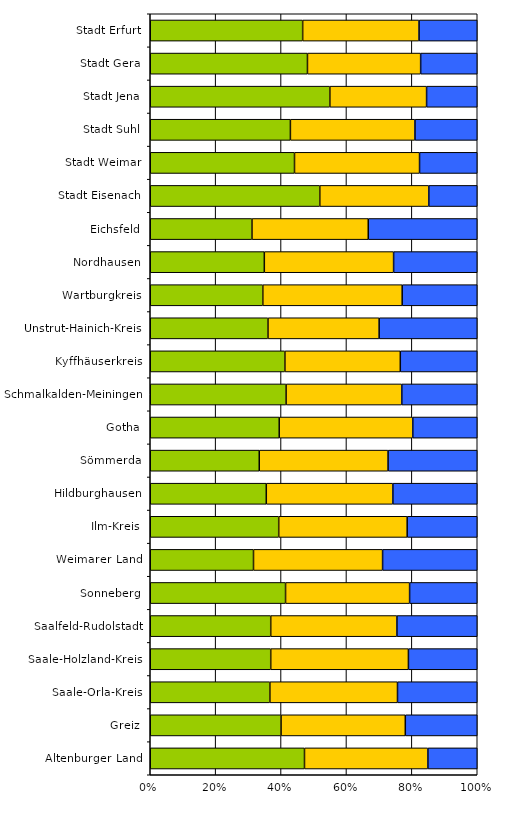
| Category | Series 0 | Series 1 | Series 2 |
|---|---|---|---|
| Altenburger Land | 25 | 20 | 8 |
| Greiz | 20 | 19 | 11 |
| Saale-Orla-Kreis | 15 | 16 | 10 |
| Saale-Holzland-Kreis | 14 | 16 | 8 |
| Saalfeld-Rudolstadt | 21 | 22 | 14 |
| Sonneberg | 12 | 11 | 6 |
| Weimarer Land | 12 | 15 | 11 |
| Ilm-Kreis | 22 | 22 | 12 |
| Hildburghausen | 11 | 12 | 8 |
| Sömmerda | 11 | 13 | 9 |
| Gotha | 28 | 29 | 14 |
| Schmalkalden-Meiningen | 27 | 23 | 15 |
| Kyffhäuserkreis | 14 | 12 | 8 |
| Unstrut-Hainich-Kreis | 18 | 17 | 15 |
| Wartburgkreis | 21 | 26 | 14 |
| Nordhausen | 15 | 17 | 11 |
| Eichsfeld | 14 | 16 | 15 |
| Stadt Eisenach | 14 | 9 | 4 |
| Stadt Weimar | 15 | 13 | 6 |
| Stadt Suhl | 9 | 8 | 4 |
| Stadt Jena | 39 | 21 | 11 |
| Stadt Gera | 25 | 18 | 9 |
| Stadt Erfurt | 55 | 42 | 21 |